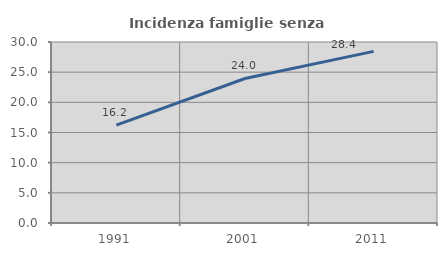
| Category | Incidenza famiglie senza nuclei |
|---|---|
| 1991.0 | 16.216 |
| 2001.0 | 23.952 |
| 2011.0 | 28.446 |